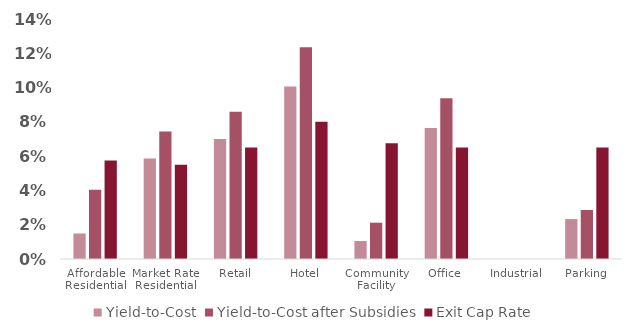
| Category | Yield-to-Cost | Yield-to-Cost after Subsidies | Exit Cap Rate |
|---|---|---|---|
| Affordable Residential | 0.015 | 0.04 | 0.058 |
| Market Rate Residential | 0.059 | 0.074 | 0.055 |
| Retail | 0.07 | 0.086 | 0.065 |
| Hotel | 0.101 | 0.123 | 0.08 |
| Community Facility | 0.01 | 0.021 | 0.068 |
| Office | 0.076 | 0.094 | 0.065 |
| Industrial | 0 | 0 | 0 |
| Parking | 0.023 | 0.029 | 0.065 |